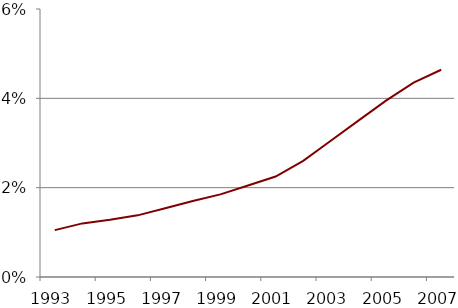
| Category | Series 0 | Series 1 |
|---|---|---|
| 1993.0 | 1993 | 0.01 |
| 1994.0 | 1994 | 0.012 |
| 1995.0 | 1995 | 0.013 |
| 1996.0 | 1996 | 0.014 |
| 1997.0 | 1997 | 0.015 |
| 1998.0 | 1998 | 0.017 |
| 1999.0 | 1999 | 0.018 |
| 2000.0 | 2000 | 0.02 |
| 2001.0 | 2001 | 0.022 |
| 2002.0 | 2002 | 0.026 |
| 2003.0 | 2003 | 0.03 |
| 2004.0 | 2004 | 0.035 |
| 2005.0 | 2005 | 0.04 |
| 2006.0 | 2006 | 0.044 |
| 2007.0 | 2007 | 0.046 |